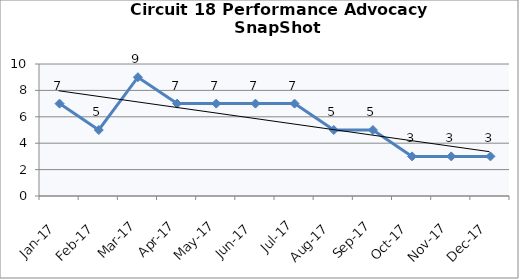
| Category | Circuit 18 |
|---|---|
| Jan-17 | 7 |
| Feb-17 | 5 |
| Mar-17 | 9 |
| Apr-17 | 7 |
| May-17 | 7 |
| Jun-17 | 7 |
| Jul-17 | 7 |
| Aug-17 | 5 |
| Sep-17 | 5 |
| Oct-17 | 3 |
| Nov-17 | 3 |
| Dec-17 | 3 |